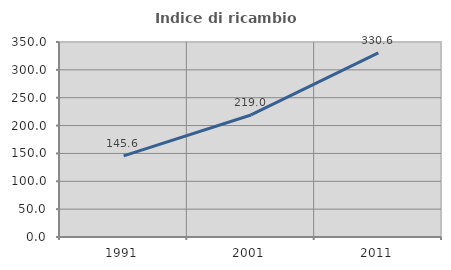
| Category | Indice di ricambio occupazionale  |
|---|---|
| 1991.0 | 145.556 |
| 2001.0 | 219.048 |
| 2011.0 | 330.556 |